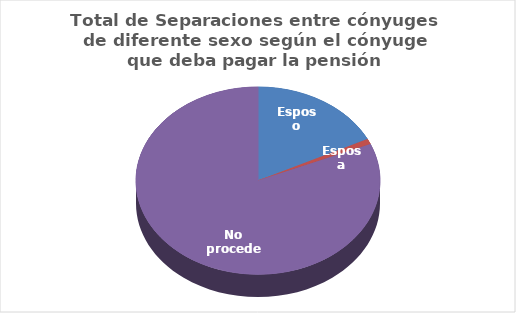
| Category | Series 0 |
|---|---|
| Esposo | 490 |
| Esposa | 26 |
| No procede | 2255 |